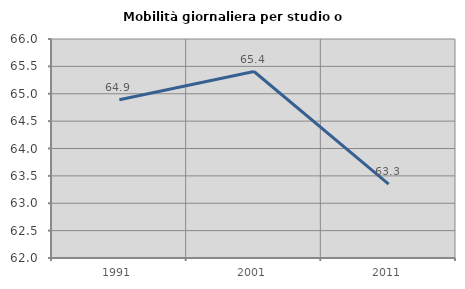
| Category | Mobilità giornaliera per studio o lavoro |
|---|---|
| 1991.0 | 64.89 |
| 2001.0 | 65.406 |
| 2011.0 | 63.35 |